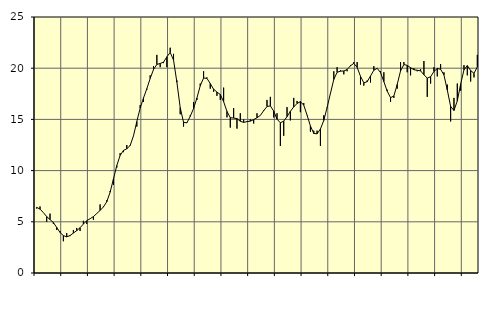
| Category | Piggar | Series 1 |
|---|---|---|
| nan | 6.3 | 6.41 |
| 87.0 | 6.5 | 6.24 |
| 87.0 | 5.9 | 5.9 |
| 87.0 | 5 | 5.51 |
| nan | 5.8 | 5.22 |
| 88.0 | 4.8 | 4.93 |
| 88.0 | 4.2 | 4.45 |
| 88.0 | 4.1 | 3.96 |
| nan | 3.1 | 3.65 |
| 89.0 | 3.9 | 3.53 |
| 89.0 | 3.6 | 3.66 |
| 89.0 | 4.2 | 3.9 |
| nan | 4.4 | 4.14 |
| 90.0 | 4.1 | 4.42 |
| 90.0 | 5.1 | 4.78 |
| 90.0 | 4.8 | 5.11 |
| nan | 5.3 | 5.3 |
| 91.0 | 5.2 | 5.51 |
| 91.0 | 5.8 | 5.81 |
| 91.0 | 6.7 | 6.11 |
| nan | 6.5 | 6.45 |
| 92.0 | 7.1 | 6.96 |
| 92.0 | 8 | 7.89 |
| 92.0 | 8.6 | 9.18 |
| nan | 10.3 | 10.49 |
| 93.0 | 11.7 | 11.49 |
| 93.0 | 11.8 | 11.97 |
| 93.0 | 12.5 | 12.13 |
| nan | 12.4 | 12.45 |
| 94.0 | 13.4 | 13.39 |
| 94.0 | 14.3 | 14.79 |
| 94.0 | 16.4 | 16.1 |
| nan | 16.7 | 17.09 |
| 95.0 | 17.9 | 18 |
| 95.0 | 19.3 | 19 |
| 95.0 | 20.2 | 19.87 |
| nan | 21.3 | 20.37 |
| 96.0 | 20.1 | 20.46 |
| 96.0 | 20.5 | 20.59 |
| 96.0 | 20.1 | 21.11 |
| nan | 22 | 21.54 |
| 97.0 | 21.4 | 20.79 |
| 97.0 | 18.8 | 18.63 |
| 97.0 | 15.5 | 16.15 |
| nan | 14.3 | 14.72 |
| 98.0 | 14.7 | 14.66 |
| 98.0 | 15.4 | 15.3 |
| 98.0 | 16.7 | 16.06 |
| nan | 16.9 | 17.09 |
| 99.0 | 18.5 | 18.28 |
| 99.0 | 19.7 | 19.04 |
| 99.0 | 19.1 | 19.01 |
| nan | 18 | 18.5 |
| 0.0 | 17.7 | 17.95 |
| 0.0 | 17.3 | 17.67 |
| 0.0 | 16.9 | 17.43 |
| nan | 18.1 | 16.74 |
| 1.0 | 15.2 | 15.78 |
| 1.0 | 14.2 | 15.17 |
| 1.0 | 16.1 | 15.13 |
| nan | 14.1 | 15.08 |
| 2.0 | 15.6 | 14.82 |
| 2.0 | 15 | 14.71 |
| 2.0 | 14.8 | 14.78 |
| nan | 15 | 14.83 |
| 3.0 | 14.6 | 14.98 |
| 3.0 | 15.6 | 15.16 |
| 3.0 | 15.4 | 15.39 |
| nan | 15.9 | 15.85 |
| 4.0 | 16.9 | 16.26 |
| 4.0 | 17.2 | 16.32 |
| 4.0 | 15.2 | 15.81 |
| nan | 15.6 | 15.02 |
| 5.0 | 12.4 | 14.67 |
| 5.0 | 13.4 | 14.83 |
| 5.0 | 16.2 | 15.27 |
| nan | 14.9 | 15.79 |
| 6.0 | 17.1 | 16.22 |
| 6.0 | 16.8 | 16.55 |
| 6.0 | 15.7 | 16.74 |
| nan | 16.6 | 16.39 |
| 7.0 | 15.4 | 15.42 |
| 7.0 | 13.8 | 14.36 |
| 7.0 | 13.9 | 13.63 |
| nan | 13.9 | 13.59 |
| 8.0 | 12.4 | 14.06 |
| 8.0 | 15.4 | 14.9 |
| 8.0 | 16.1 | 16.16 |
| nan | 17.5 | 17.54 |
| 9.0 | 19.7 | 18.9 |
| 9.0 | 20.1 | 19.6 |
| 9.0 | 19.8 | 19.71 |
| nan | 19.4 | 19.73 |
| 10.0 | 19.7 | 19.87 |
| 10.0 | 20.3 | 20.24 |
| 10.0 | 20.6 | 20.47 |
| nan | 20.6 | 20.08 |
| 11.0 | 18.4 | 19.21 |
| 11.0 | 18.3 | 18.57 |
| 11.0 | 18.8 | 18.68 |
| nan | 18.6 | 19.24 |
| 12.0 | 20.2 | 19.8 |
| 12.0 | 20 | 19.99 |
| 12.0 | 19.7 | 19.57 |
| nan | 19.6 | 18.69 |
| 13.0 | 17.9 | 17.76 |
| 13.0 | 16.7 | 17.12 |
| 13.0 | 17.1 | 17.29 |
| nan | 18 | 18.41 |
| 14.0 | 20.6 | 19.74 |
| 14.0 | 20.6 | 20.36 |
| 14.0 | 19.6 | 20.27 |
| nan | 19.3 | 20.05 |
| 15.0 | 20 | 19.85 |
| 15.0 | 19.7 | 19.8 |
| 15.0 | 19.9 | 19.74 |
| nan | 20.7 | 19.36 |
| 16.0 | 17.2 | 19.03 |
| 16.0 | 18.5 | 19.17 |
| 16.0 | 20.1 | 19.68 |
| nan | 19.2 | 19.97 |
| 17.0 | 20.4 | 19.9 |
| 17.0 | 19.6 | 19.34 |
| 17.0 | 18.4 | 17.88 |
| nan | 14.8 | 16.27 |
| 18.0 | 17.1 | 15.87 |
| 18.0 | 18.5 | 16.81 |
| 18.0 | 17.8 | 18.44 |
| nan | 20.3 | 19.84 |
| 19.0 | 19.3 | 20.25 |
| 19.0 | 18.7 | 19.77 |
| 19.0 | 19.1 | 19.5 |
| nan | 21.3 | 20.13 |